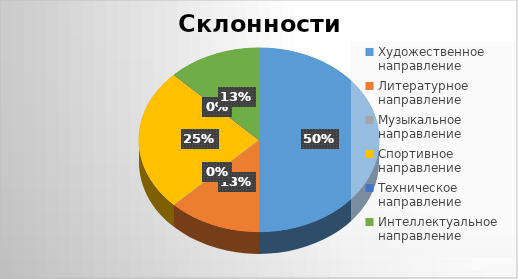
| Category | Series 0 |
|---|---|
| Художественное направление | 4 |
| Литературное направление | 1 |
| Музыкальное направление | 0 |
| Спортивное направление | 2 |
| Техническое направление | 0 |
| Интеллектуальное направление | 1 |